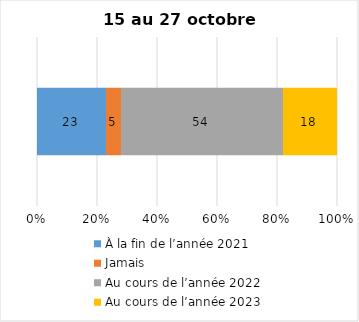
| Category | À la fin de l’année 2021 | Jamais | Au cours de l’année 2022 | Au cours de l’année 2023 |
|---|---|---|---|---|
| 0 | 23 | 5 | 54 | 18 |